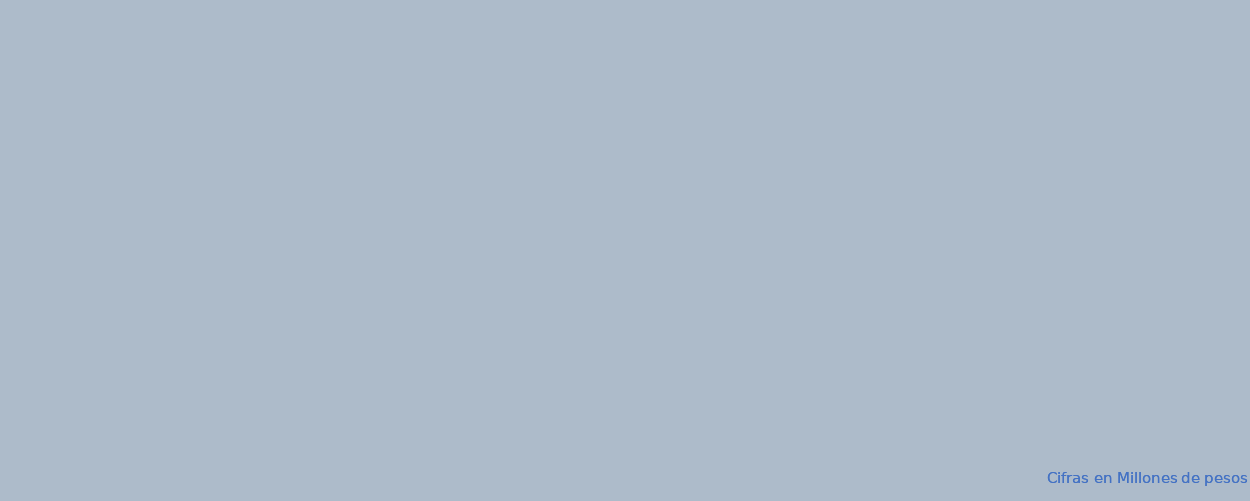
| Category | APROPIACION | COMPROMISOS |  OBLIGACIONES |  PAGOS |
|---|---|---|---|---|
| A-FUNCIONAMIENTO | 99785.985 | 33825.697 | 25839.823 | 24693.09 |
| B-SERVICIO DE LA DEUDA PÚBLICA | 1167604.335 | 157603.582 | 157603.582 | 157603.582 |
| C- INVERSION | 4505182.025 | 4323130.283 | 335854.596 | 335667.534 |